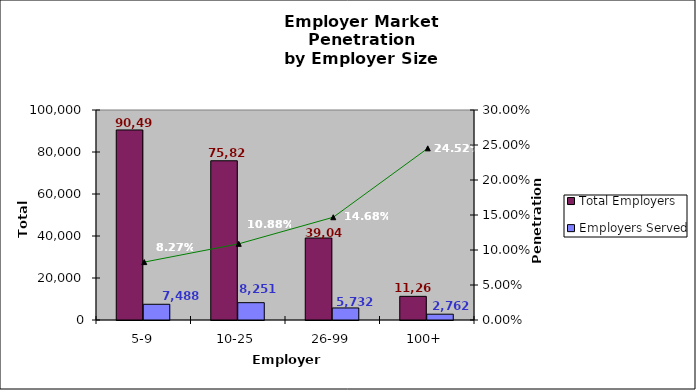
| Category | Total Employers | Employers Served |
|---|---|---|
| 5-9 | 90495 | 7488 |
| 10-25 | 75824 | 8251 |
| 26-99 | 39047 | 5732 |
| 100+ | 11264 | 2762 |